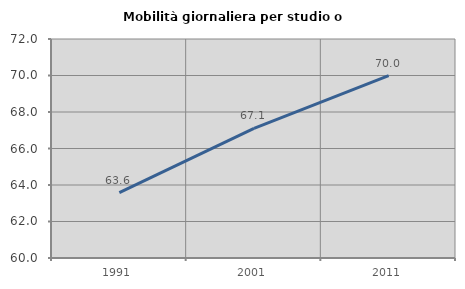
| Category | Mobilità giornaliera per studio o lavoro |
|---|---|
| 1991.0 | 63.58 |
| 2001.0 | 67.102 |
| 2011.0 | 69.988 |